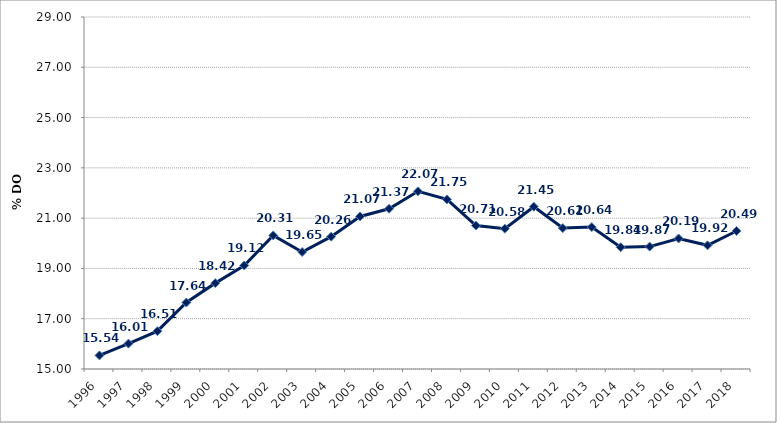
| Category | Series 0 |
|---|---|
| 1996 | 15.54 |
| 1997 | 16.011 |
| 1998 | 16.505 |
| 1999 | 17.644 |
| 2000 | 18.415 |
| 2001 | 19.117 |
| 2002 | 20.311 |
| 2003 | 19.654 |
| 2004 | 20.264 |
| 2005 | 21.068 |
| 2006 | 21.374 |
| 2007 | 22.069 |
| 2008 | 21.746 |
| 2009 | 20.706 |
| 2010 | 20.581 |
| 2011 | 21.454 |
| 2012 | 20.605 |
| 2013 | 20.644 |
| 2014 | 19.844 |
| 2015 | 19.868 |
| 2016 | 20.192 |
| 2017 | 19.919 |
| 2018 | 20.489 |